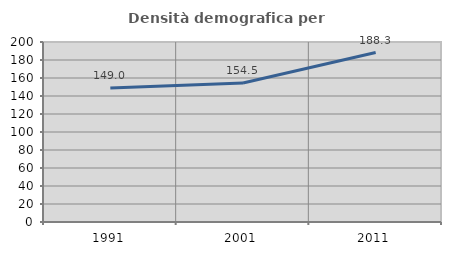
| Category | Densità demografica |
|---|---|
| 1991.0 | 148.957 |
| 2001.0 | 154.512 |
| 2011.0 | 188.28 |